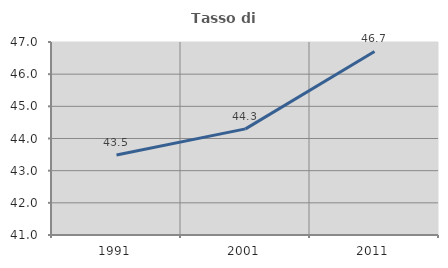
| Category | Tasso di occupazione   |
|---|---|
| 1991.0 | 43.488 |
| 2001.0 | 44.299 |
| 2011.0 | 46.707 |